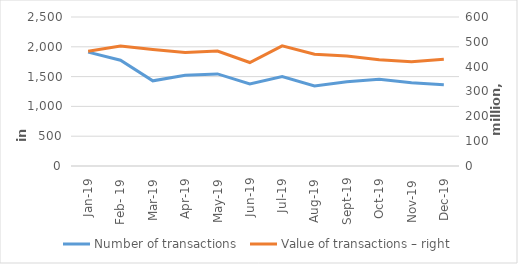
| Category | Number of transactions  |
|---|---|
| sij.19 | 1910679 |
| Feb- 19 | 1774324 |
| ožu.19 | 1428944 |
| Apr-19 | 1522519 |
| svi.19 | 1544732 |
| lip.19 | 1377848 |
| srp.19 | 1501759 |
| kol.19 | 1342453 |
| ruj.19 | 1415459 |
| lis.19 | 1456610 |
| stu.19 | 1395995 |
| Dec-19 | 1362673 |